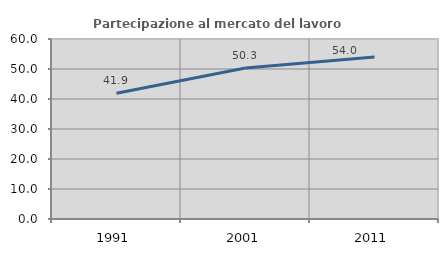
| Category | Partecipazione al mercato del lavoro  femminile |
|---|---|
| 1991.0 | 41.905 |
| 2001.0 | 50.328 |
| 2011.0 | 53.989 |